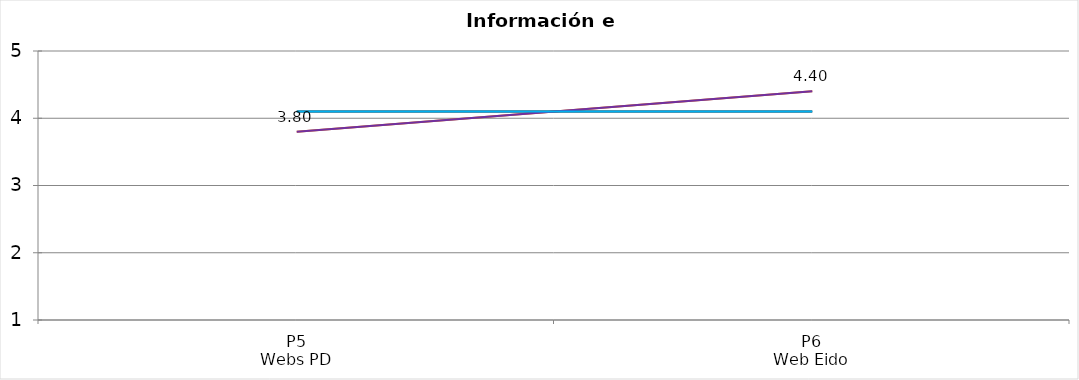
| Category | Valoración (1-5) | MEDIA |
|---|---|---|
| P5
Webs PD | 3.8 | 4.1 |
| P6
Web Eido | 4.4 | 4.1 |